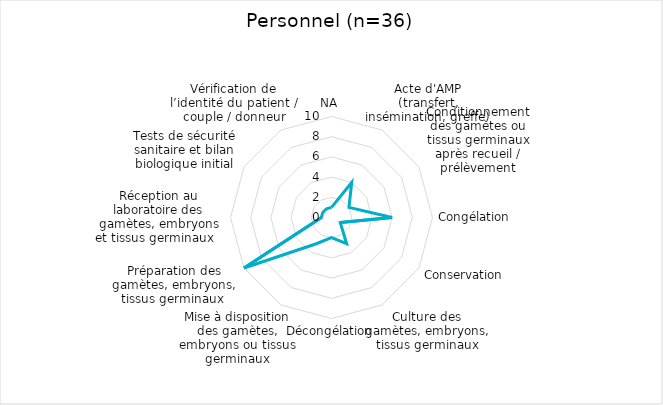
| Category | Series 0 |
|---|---|
| NA | 1 |
| Acte d'AMP (transfert, insémination, greffe) | 4 |
| Conditionnement des gamètes ou tissus germinaux après recueil / prélèvement | 2 |
| Congélation | 6 |
| Conservation | 1 |
| Culture des gamètes, embryons, tissus germinaux | 3 |
| Décongélation | 2 |
| Mise à disposition des gamètes, embryons ou tissus germinaux | 3 |
| Préparation des gamètes, embryons, tissus germinaux  | 10 |
| Réception au laboratoire des gamètes, embryons et tissus germinaux   | 1 |
| Tests de sécurité sanitaire et bilan biologique initial | 1 |
| Vérification de l’identité du patient / couple / donneur | 1 |